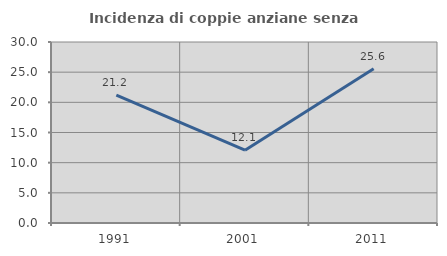
| Category | Incidenza di coppie anziane senza figli  |
|---|---|
| 1991.0 | 21.212 |
| 2001.0 | 12.069 |
| 2011.0 | 25.581 |